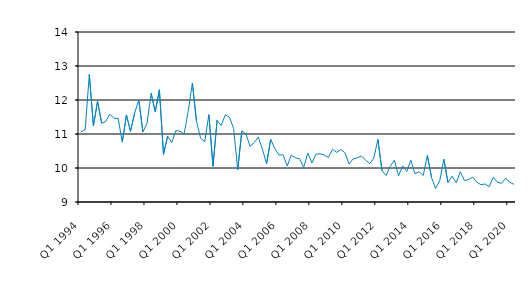
| Category | Series 0 |
|---|---|
| Q1 1994 | 11.067 |
| Q2 1994 | 11.129 |
| Q3 1994 | 12.75 |
| Q4 1994 | 11.238 |
| Q1 1995 | 11.961 |
| Q2 1995 | 11.316 |
| Q3 1995 | 11.37 |
| Q4 1995 | 11.583 |
| Q1 1996 | 11.46 |
| Q2 1996 | 11.458 |
| Q3 1996 | 10.759 |
| Q4 1996 | 11.56 |
| Q1 1997 | 11.08 |
| Q2 1997 | 11.616 |
| Q3 1997 | 12 |
| Q4 1997 | 11.059 |
| Q1 1998 | 11.312 |
| Q2 1998 | 12.199 |
| Q3 1998 | 11.649 |
| Q4 1998 | 12.3 |
| Q1 1999 | 10.4 |
| Q2 1999 | 10.939 |
| Q3 1999 | 10.75 |
| Q4 1999 | 11.1 |
| Q1 2000 | 11.08 |
| Q2 2000 | 11 |
| Q3 2000 | 11.679 |
| Q4 2000 | 12.5 |
| Q1 2001 | 11.375 |
| Q2 2001 | 10.875 |
| Q3 2001 | 10.775 |
| Q4 2001 | 11.57 |
| Q1 2002 | 10.05 |
| Q2 2002 | 11.405 |
| Q3 2002 | 11.25 |
| Q4 2002 | 11.566 |
| Q1 2003 | 11.492 |
| Q2 2003 | 11.162 |
| Q3 2003 | 9.95 |
| Q4 2003 | 11.091 |
| Q1 2004 | 11 |
| Q2 2004 | 10.638 |
| Q3 2004 | 10.75 |
| Q4 2004 | 10.908 |
| Q1 2005 | 10.55 |
| Q2 2005 | 10.125 |
| Q3 2005 | 10.843 |
| Q4 2005 | 10.573 |
| Q1 2006 | 10.38 |
| Q2 2006 | 10.387 |
| Q3 2006 | 10.06 |
| Q4 2006 | 10.38 |
| Q1 2007 | 10.3 |
| Q2 2007 | 10.27 |
| Q3 2007 | 10.017 |
| Q4 2007 | 10.44 |
| Q1 2008 | 10.15 |
| Q2 2008 | 10.41 |
| Q3 2008 | 10.42 |
| Q4 2008 | 10.38 |
| Q1 2009 | 10.31 |
| Q2 2009 | 10.55 |
| Q3 2009 | 10.46 |
| Q4 2009 | 10.54 |
| Q1 2010 | 10.45 |
| Q2 2010 | 10.12 |
| Q3 2010 | 10.27 |
| Q4 2010 | 10.3 |
| Q1 2011 | 10.35 |
| Q2 2011 | 10.24 |
| Q3 2011 | 10.125 |
| Q4 2011 | 10.29 |
| Q1 2012 | 10.84 |
| Q2 2012 | 9.92 |
| Q3 2012 | 9.78 |
| Q4 2012 | 10.05 |
| Q1 2013 | 10.23 |
| Q2 2013 | 9.77 |
| Q3 2013 | 10.06 |
| Q4 2013 | 9.9 |
| Q1 2014 | 10.23 |
| Q2 2014 | 9.83 |
| Q3 2014 | 9.89 |
| Q4 2014 | 9.78 |
| Q1 2015 | 10.37 |
| Q2 2015 | 9.726 |
| Q3 2015 | 9.4 |
| Q4 2015 | 9.62 |
| Q1 2016 | 10.26 |
| Q2 2016 | 9.57 |
| Q3 2016 | 9.76 |
| Q4 2016 | 9.57 |
| Q1 2017 | 9.89 |
| Q2 2017 | 9.63 |
| Q3 2017 | 9.66 |
| Q4 2017 | 9.73 |
| Q1 2018 | 9.58 |
| Q2 2018 | 9.51 |
| Q3 2018 | 9.53 |
| Q4 2018 | 9.45 |
| Q1 2019 | 9.73 |
| Q2 2019 | 9.58 |
| Q3 2019 | 9.55 |
| Q4 2019 | 9.7 |
| Q1 2020 | 9.58 |
| Q2 2021 | 9.52 |